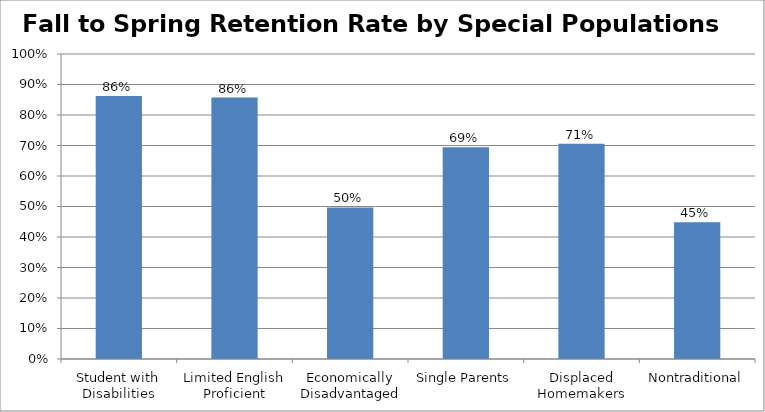
| Category | Fall to Spring Retention Rate for POS Students |
|---|---|
| Student with Disabilities | 0.862 |
| Limited English Proficient | 0.857 |
| Economically Disadvantaged | 0.497 |
| Single Parents | 0.694 |
| Displaced Homemakers | 0.706 |
| Nontraditional | 0.449 |